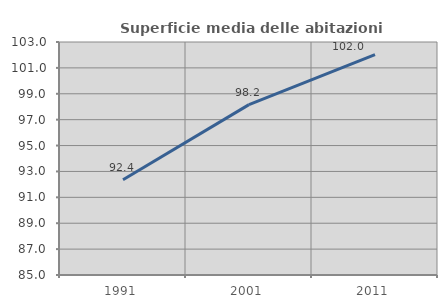
| Category | Superficie media delle abitazioni occupate |
|---|---|
| 1991.0 | 92.359 |
| 2001.0 | 98.163 |
| 2011.0 | 102.02 |